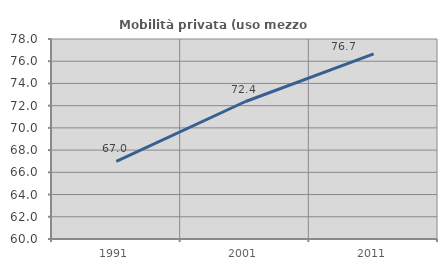
| Category | Mobilità privata (uso mezzo privato) |
|---|---|
| 1991.0 | 66.989 |
| 2001.0 | 72.353 |
| 2011.0 | 76.658 |